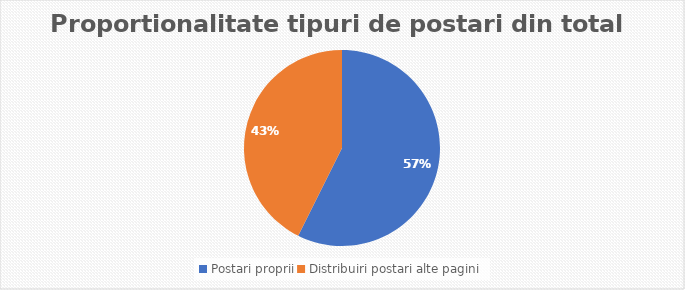
| Category | Series 0 |
|---|---|
| Postari proprii | 35 |
| Distribuiri postari alte pagini | 26 |